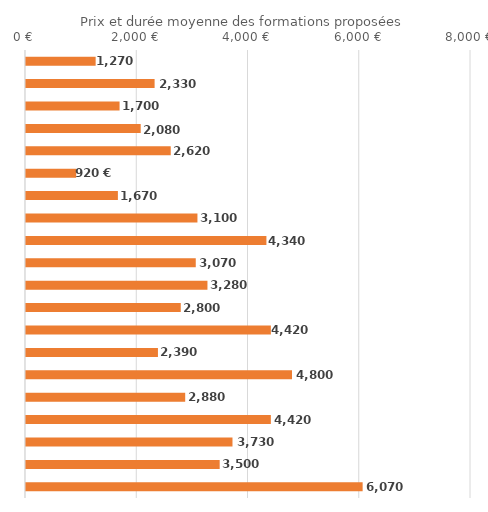
| Category | Series 0 |
|---|---|
| Transports, manutention, magasinage | 1270 |
| Langues vivantes, civilisations étrangères et régionales | 2330 |
| Developpement des capacités d'orientation,d'insertion ou de réinsertion | 1700 |
| Secrétariat, bureautique | 2080 |
| Informatique, traitement de l'information, réseaux de transmission | 2620 |
| Sécurite des biens et des personnes, police, surveillance | 920 |
| Spécialités pluritechnologiques génie civil, construction, bois | 1670 |
| Enseignement, formation | 3100 |
| Commerce, vente | 4340 |
| Coiffure, esthétique et autres spécialites de services aux personnes | 3070 |
| Comptabilite, gestion | 3280 |
| Agro-alimentaire, alimentation, cuisine | 2800 |
| Ressources humaines, gestion du personnel, gestion de l'emploi | 4420 |
| Techniques de l'imprimerie et de l'édition | 2390 |
| Travail social | 4800 |
| Mécanique générale et de précision, usinage | 2880 |
| Animation sportive, culturelle et de Loisirs | 4420 |
| Spécialites plurivalentes de la communication et de l'information | 3730 |
| Spécialités plurivalentes des échanges et de la gestion | 3500 |
| Santé | 6070 |